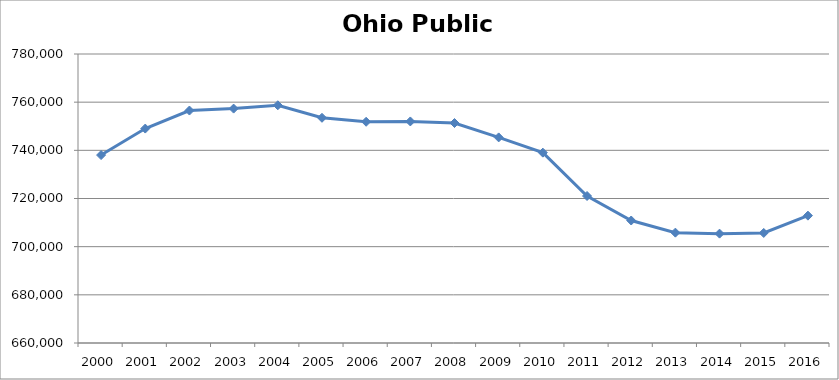
| Category | Ohio |
|---|---|
| 2000 | 738030 |
| 2001 | 749036 |
| 2002 | 756522 |
| 2003 | 757325 |
| 2004 | 758708 |
| 2005 | 753515 |
| 2006 | 751858 |
| 2007 | 751994 |
| 2008 | 751347 |
| 2009 | 745373 |
| 2010 | 739039 |
| 2011 | 721038 |
| 2012 | 710865 |
| 2013 | 705826 |
| 2014 | 705415 |
| 2015 | 705689 |
| 2016 | 712877 |